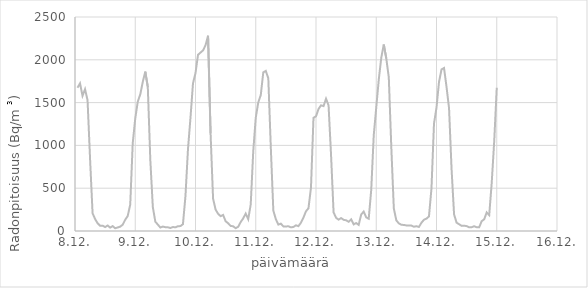
| Category | Series 0 |
|---|---|
| 43077.041666666664 | 1673.48 |
| 43077.083333333336 | 1724.84 |
| 43077.125 | 1579.32 |
| 43077.166666666664 | 1656.36 |
| 43077.208333333336 | 1527.96 |
| 43077.25 | 843.16 |
| 43077.291666666664 | 207.58 |
| 43077.333333333336 | 140.17 |
| 43077.375 | 90.415 |
| 43077.416666666664 | 61.525 |
| 43077.458333333336 | 62.06 |
| 43077.5 | 46.01 |
| 43077.541666666664 | 64.2 |
| 43077.583333333336 | 39.59 |
| 43077.625 | 57.245 |
| 43077.666666666664 | 32.1 |
| 43077.708333333336 | 41.195 |
| 43077.75 | 50.825 |
| 43077.791666666664 | 73.295 |
| 43077.833333333336 | 131.61 |
| 43077.875 | 175.48 |
| 43077.916666666664 | 308.16 |
| 43077.958333333336 | 1027.2 |
| 43078.0 | 1313.96 |
| 43078.041666666664 | 1510.84 |
| 43078.083333333336 | 1596.44 |
| 43078.125 | 1741.96 |
| 43078.166666666664 | 1861.8 |
| 43078.208333333336 | 1682.04 |
| 43078.25 | 830.32 |
| 43078.291666666664 | 280.34 |
| 43078.333333333336 | 108.605 |
| 43078.375 | 74.9 |
| 43078.416666666664 | 40.393 |
| 43078.458333333336 | 51.895 |
| 43078.5 | 44.138 |
| 43078.541666666664 | 43.068 |
| 43078.583333333336 | 35.043 |
| 43078.625 | 46.545 |
| 43078.666666666664 | 42.533 |
| 43078.708333333336 | 56.175 |
| 43078.75 | 57.245 |
| 43078.791666666664 | 79.715 |
| 43078.833333333336 | 406.6 |
| 43078.875 | 954.44 |
| 43078.916666666664 | 1322.52 |
| 43078.958333333336 | 1724.84 |
| 43079.0 | 1844.68 |
| 43079.041666666664 | 2058.68 |
| 43079.083333333336 | 2084.36 |
| 43079.125 | 2110.04 |
| 43079.166666666664 | 2169.96 |
| 43079.208333333336 | 2281.24 |
| 43079.25 | 1142.76 |
| 43079.291666666664 | 378.78 |
| 43079.333333333336 | 250.38 |
| 43079.375 | 201.16 |
| 43079.416666666664 | 173.34 |
| 43079.458333333336 | 187.25 |
| 43079.5 | 113.955 |
| 43079.541666666664 | 90.415 |
| 43079.583333333336 | 59.385 |
| 43079.625 | 55.105 |
| 43079.666666666664 | 32.902 |
| 43079.708333333336 | 49.22 |
| 43079.75 | 104.325 |
| 43079.791666666664 | 147.66 |
| 43079.833333333336 | 203.3 |
| 43079.875 | 138.03 |
| 43079.916666666664 | 310.3 |
| 43079.958333333336 | 928.76 |
| 43080.0 | 1322.52 |
| 43080.041666666664 | 1502.28 |
| 43080.083333333336 | 1587.88 |
| 43080.125 | 1853.24 |
| 43080.166666666664 | 1870.36 |
| 43080.208333333336 | 1784.76 |
| 43080.25 | 975.84 |
| 43080.291666666664 | 239.68 |
| 43080.333333333336 | 138.03 |
| 43080.375 | 74.9 |
| 43080.416666666664 | 85.6 |
| 43080.458333333336 | 53.768 |
| 43080.5 | 52.965 |
| 43080.541666666664 | 55.372 |
| 43080.583333333336 | 42.8 |
| 43080.625 | 47.08 |
| 43080.666666666664 | 66.34 |
| 43080.708333333336 | 57.245 |
| 43080.75 | 96.3 |
| 43080.791666666664 | 157.29 |
| 43080.833333333336 | 230.05 |
| 43080.875 | 265.36 |
| 43080.916666666664 | 507.18 |
| 43080.958333333336 | 1322.52 |
| 43081.0 | 1339.64 |
| 43081.041666666664 | 1425.24 |
| 43081.083333333336 | 1468.04 |
| 43081.125 | 1459.48 |
| 43081.166666666664 | 1545.08 |
| 43081.208333333336 | 1468.04 |
| 43081.25 | 885.96 |
| 43081.291666666664 | 218.28 |
| 43081.333333333336 | 154.08 |
| 43081.375 | 132.68 |
| 43081.416666666664 | 150.87 |
| 43081.458333333336 | 130.54 |
| 43081.5 | 125.19 |
| 43081.541666666664 | 108.07 |
| 43081.583333333336 | 135.89 |
| 43081.625 | 77.04 |
| 43081.666666666664 | 93.09 |
| 43081.708333333336 | 71.155 |
| 43081.75 | 192.6 |
| 43081.791666666664 | 226.84 |
| 43081.833333333336 | 159.43 |
| 43081.875 | 143.38 |
| 43081.916666666664 | 481.5 |
| 43081.958333333336 | 1117.08 |
| 43082.0 | 1442.36 |
| 43082.041666666664 | 1767.64 |
| 43082.083333333336 | 2024.44 |
| 43082.125 | 2178.52 |
| 43082.166666666664 | 2015.88 |
| 43082.208333333336 | 1793.32 |
| 43082.25 | 975.84 |
| 43082.291666666664 | 263.22 |
| 43082.333333333336 | 124.12 |
| 43082.375 | 88.81 |
| 43082.416666666664 | 72.76 |
| 43082.458333333336 | 70.62 |
| 43082.5 | 65.27 |
| 43082.541666666664 | 63.13 |
| 43082.583333333336 | 63.13 |
| 43082.625 | 49.755 |
| 43082.666666666664 | 55.64 |
| 43082.708333333336 | 47.615 |
| 43082.75 | 96.3 |
| 43082.791666666664 | 131.61 |
| 43082.833333333336 | 144.45 |
| 43082.875 | 170.13 |
| 43082.916666666664 | 498.62 |
| 43082.958333333336 | 1254.04 |
| 43083.0 | 1442.36 |
| 43083.041666666664 | 1741.96 |
| 43083.083333333336 | 1887.48 |
| 43083.125 | 1904.6 |
| 43083.166666666664 | 1682.04 |
| 43083.208333333336 | 1433.8 |
| 43083.25 | 723.32 |
| 43083.291666666664 | 193.67 |
| 43083.333333333336 | 97.37 |
| 43083.375 | 79.18 |
| 43083.416666666664 | 59.92 |
| 43083.458333333336 | 62.06 |
| 43083.5 | 57.245 |
| 43083.541666666664 | 42.533 |
| 43083.583333333336 | 44.405 |
| 43083.625 | 55.64 |
| 43083.666666666664 | 43.602 |
| 43083.708333333336 | 43.87 |
| 43083.75 | 115.025 |
| 43083.791666666664 | 136.96 |
| 43083.833333333336 | 217.21 |
| 43083.875 | 185.11 |
| 43083.916666666664 | 564.96 |
| 43083.958333333336 | 1052.88 |
| 43084.0 | 1673.48 |